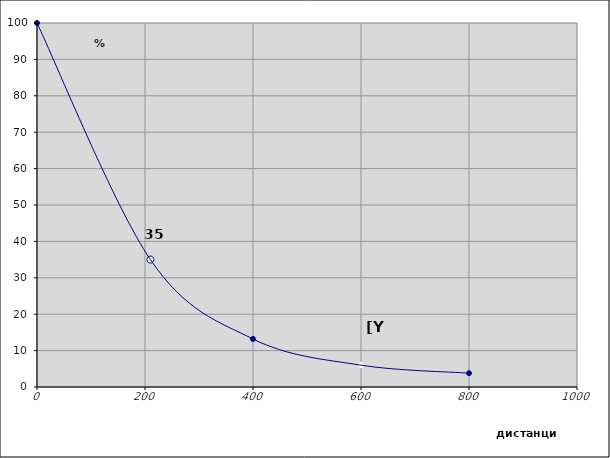
| Category | Series 0 |
|---|---|
| 0.0 | 100 |
| 210.0 | 35 |
| 400.0 | 13.2 |
| 600.0 | 6 |
| 800.0 | 3.8 |